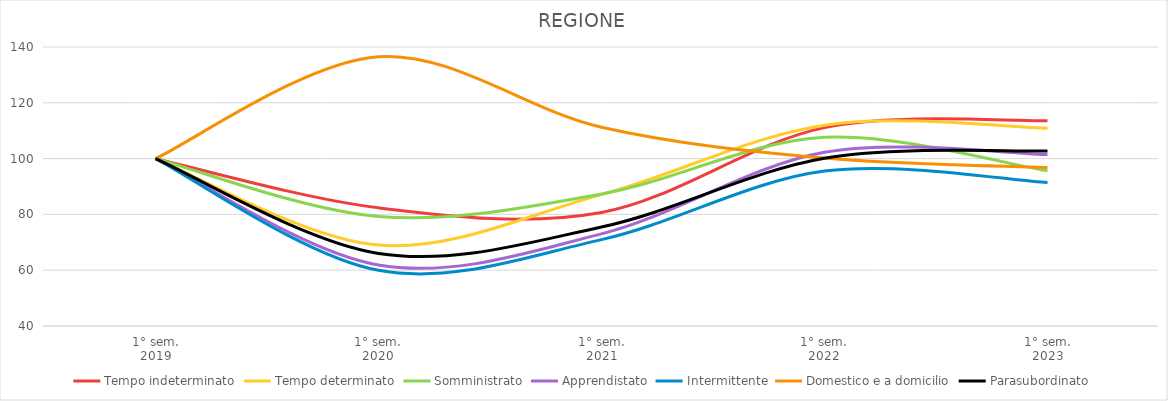
| Category | Tempo indeterminato | Tempo determinato | Somministrato | Apprendistato | Intermittente | Domestico e a domicilio | Parasubordinato |
|---|---|---|---|---|---|---|---|
| 1° sem.
2019 | 100 | 100 | 100 | 100 | 100 | 100 | 100 |
| 1° sem.
2020 | 82.348 | 68.995 | 79.276 | 61.864 | 59.946 | 136.509 | 66.022 |
| 1° sem.
2021 | 80.689 | 87.095 | 87.338 | 73.033 | 70.969 | 111.232 | 75.489 |
| 1° sem.
2022 | 111.105 | 111.979 | 107.619 | 102.257 | 95.527 | 100.215 | 100.152 |
| 1° sem.
2023 | 113.61 | 110.88 | 95.61 | 101.427 | 91.39 | 96.773 | 102.766 |